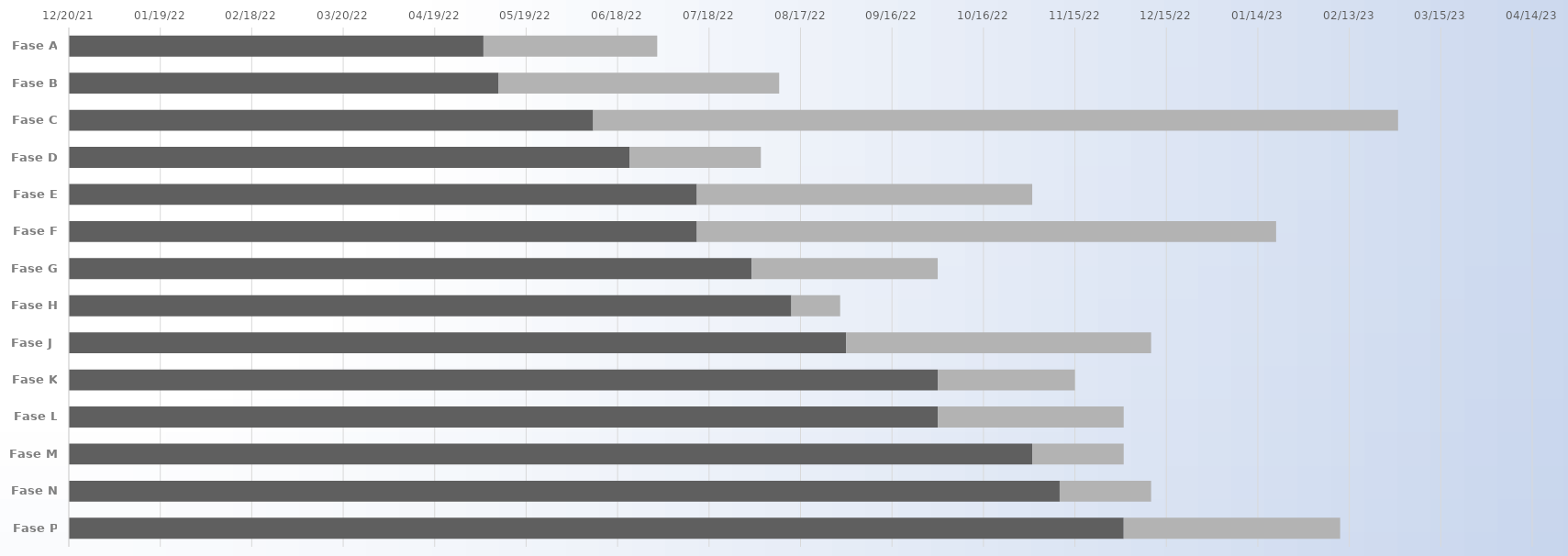
| Category | INIZIO | Durata |
|---|---|---|
| Fase A | 2022-05-05 | 57 |
| Fase B | 2022-05-10 | 92 |
| Fase C | 2022-06-10 | 264 |
| Fase D | 2022-06-22 | 43 |
| Fase E | 2022-07-14 | 110 |
| Fase F | 2022-07-14 | 190 |
| Fase G | 2022-08-01 | 61 |
| Fase H | 2022-08-14 | 16 |
| Fase J | 2022-09-01 | 100 |
| Fase K | 2022-10-01 | 45 |
| Fase L | 2022-10-01 | 61 |
| Fase M | 2022-11-01 | 30 |
| Fase N | 2022-11-10 | 30 |
| Fase P | 2022-12-01 | 71 |